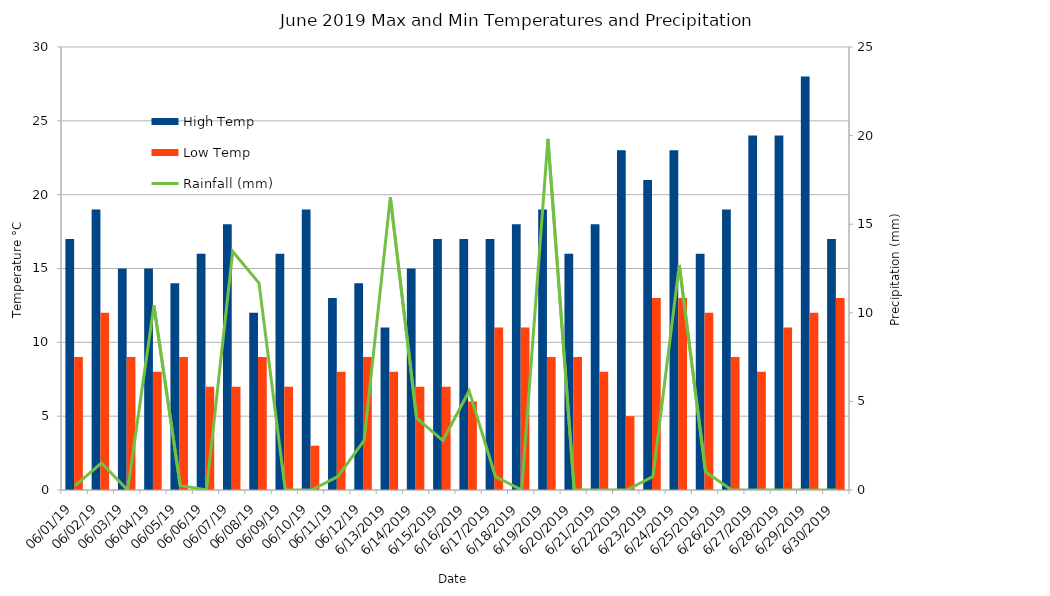
| Category | High Temp | Low Temp |
|---|---|---|
| 06/01/19 | 17 | 9 |
| 06/02/19 | 19 | 12 |
| 06/03/19 | 15 | 9 |
| 06/04/19 | 15 | 8 |
| 06/05/19 | 14 | 9 |
| 06/06/19 | 16 | 7 |
| 06/07/19 | 18 | 7 |
| 06/08/19 | 12 | 9 |
| 06/09/19 | 16 | 7 |
| 06/10/19 | 19 | 3 |
| 06/11/19 | 13 | 8 |
| 06/12/19 | 14 | 9 |
| 6/13/2019 | 11 | 8 |
| 6/14/2019 | 15 | 7 |
| 6/15/2019 | 17 | 7 |
| 6/16/2019 | 17 | 6 |
| 6/17/2019 | 17 | 11 |
| 6/18/2019 | 18 | 11 |
| 6/19/2019 | 19 | 9 |
| 6/20/2019 | 16 | 9 |
| 6/21/2019 | 18 | 8 |
| 6/22/2019 | 23 | 5 |
| 6/23/2019 | 21 | 13 |
| 6/24/2019 | 23 | 13 |
| 6/25/2019 | 16 | 12 |
| 6/26/2019 | 19 | 9 |
| 6/27/2019 | 24 | 8 |
| 6/28/2019 | 24 | 11 |
| 6/29/2019 | 28 | 12 |
| 6/30/2019 | 17 | 13 |